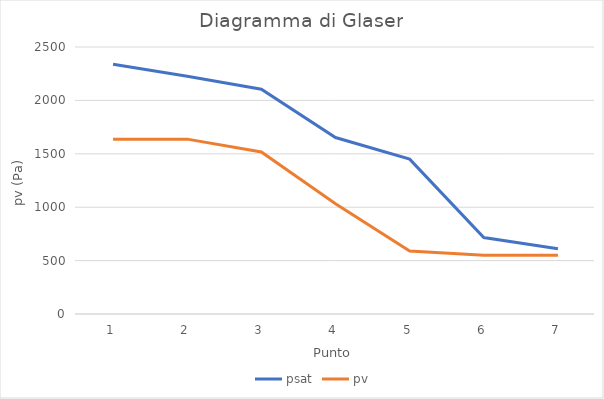
| Category | psat | pv |
|---|---|---|
| 0 | 2338.9 | 1637.23 |
| 1 | 2226 | 1637.23 |
| 2 | 2104.4 | 1516.436 |
| 3 | 1652.1 | 1033.258 |
| 4 | 1450.2 | 589.523 |
| 5 | 716.4 | 550.08 |
| 6 | 611.2 | 550.08 |